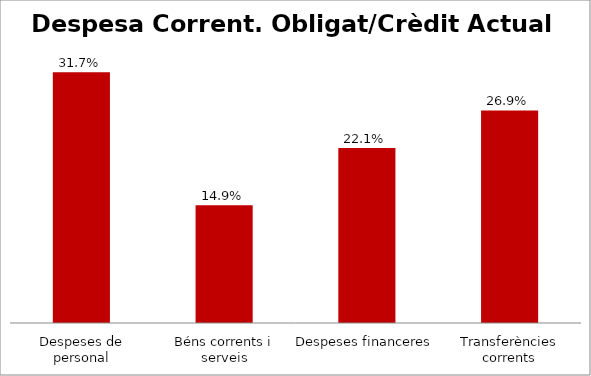
| Category | Series 0 |
|---|---|
| Despeses de personal | 0.317 |
| Béns corrents i serveis | 0.149 |
| Despeses financeres | 0.221 |
| Transferències corrents | 0.269 |